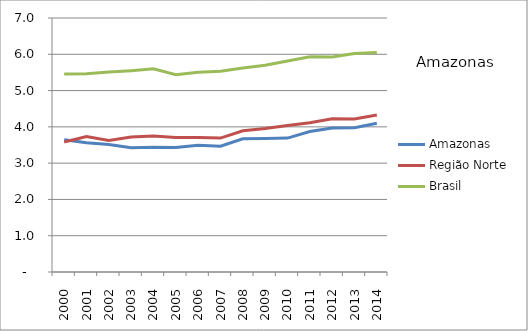
| Category | Amazonas | Região Norte | Brasil |
|---|---|---|---|
| 2000.0 | 3.643 | 3.584 | 5.458 |
| 2001.0 | 3.565 | 3.732 | 5.467 |
| 2002.0 | 3.516 | 3.625 | 5.513 |
| 2003.0 | 3.422 | 3.72 | 5.549 |
| 2004.0 | 3.436 | 3.745 | 5.599 |
| 2005.0 | 3.431 | 3.709 | 5.438 |
| 2006.0 | 3.494 | 3.704 | 5.507 |
| 2007.0 | 3.467 | 3.69 | 5.531 |
| 2008.0 | 3.671 | 3.894 | 5.623 |
| 2009.0 | 3.676 | 3.953 | 5.699 |
| 2010.0 | 3.69 | 4.037 | 5.816 |
| 2011.0 | 3.873 | 4.116 | 5.93 |
| 2012.0 | 3.969 | 4.224 | 5.928 |
| 2013.0 | 3.973 | 4.216 | 6.021 |
| 2014.0 | 4.099 | 4.325 | 6.051 |